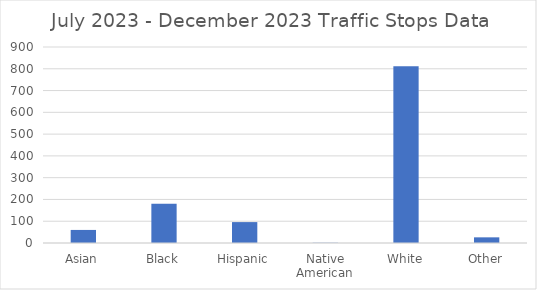
| Category | Series 0 |
|---|---|
| Asian | 60 |
| Black | 180 |
| Hispanic | 96 |
| Native American | 1 |
| White | 812 |
| Other | 26 |